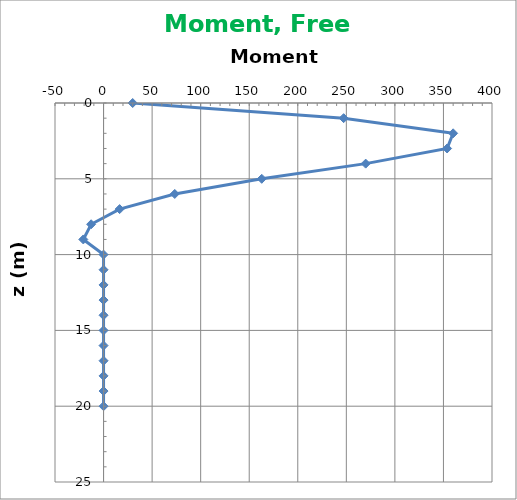
| Category | Series 0 |
|---|---|
| 30.0 | 0 |
| 247.23485676664396 | 1 |
| 359.977932451916 | 2 |
| 353.7590988659996 | 3 |
| 269.9140988146536 | 4 |
| 162.9029502001019 | 5 |
| 73.3136405897782 | 6 |
| 16.55111225292823 | 7 |
| -12.78846233492791 | 8 |
| -20.85811451967463 | 9 |
| 0.0 | 10 |
| 0.0 | 11 |
| 0.0 | 12 |
| 0.0 | 13 |
| 0.0 | 14 |
| 0.0 | 15 |
| 0.0 | 16 |
| 0.0 | 17 |
| 0.0 | 18 |
| 0.0 | 19 |
| 0.0 | 20 |